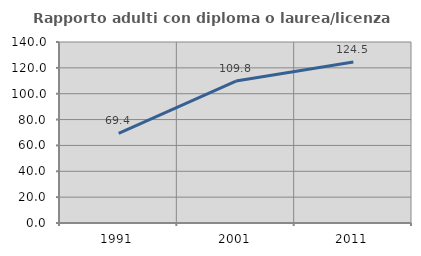
| Category | Rapporto adulti con diploma o laurea/licenza media  |
|---|---|
| 1991.0 | 69.353 |
| 2001.0 | 109.761 |
| 2011.0 | 124.451 |